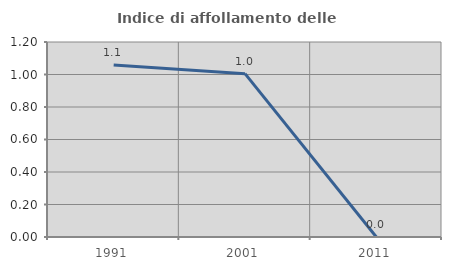
| Category | Indice di affollamento delle abitazioni  |
|---|---|
| 1991.0 | 1.058 |
| 2001.0 | 1.005 |
| 2011.0 | 0 |